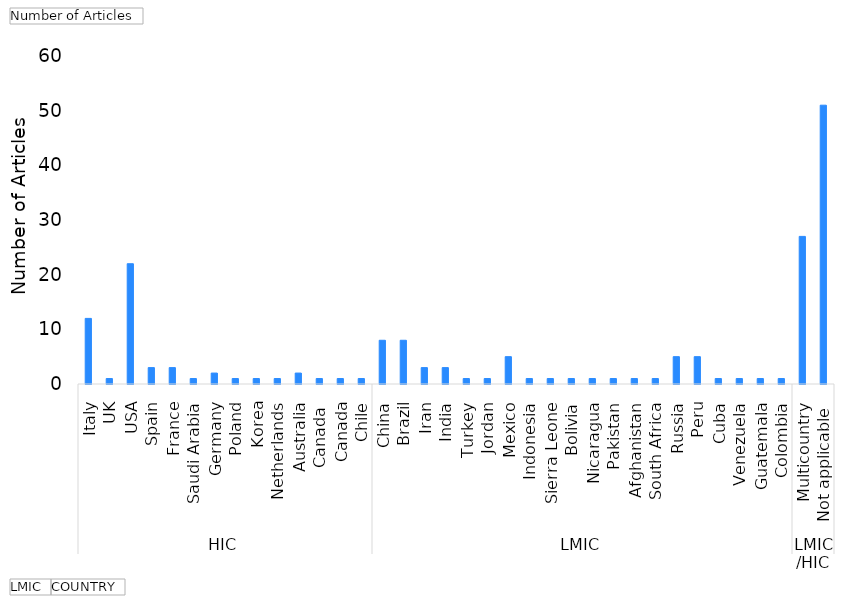
| Category | Total |
|---|---|
| 0 | 12 |
| 1 | 1 |
| 2 | 22 |
| 3 | 3 |
| 4 | 3 |
| 5 | 1 |
| 6 | 2 |
| 7 | 1 |
| 8 | 1 |
| 9 | 1 |
| 10 | 2 |
| 11 | 1 |
| 12 | 1 |
| 13 | 1 |
| 14 | 8 |
| 15 | 8 |
| 16 | 3 |
| 17 | 3 |
| 18 | 1 |
| 19 | 1 |
| 20 | 5 |
| 21 | 1 |
| 22 | 1 |
| 23 | 1 |
| 24 | 1 |
| 25 | 1 |
| 26 | 1 |
| 27 | 1 |
| 28 | 5 |
| 29 | 5 |
| 30 | 1 |
| 31 | 1 |
| 32 | 1 |
| 33 | 1 |
| 34 | 27 |
| 35 | 51 |